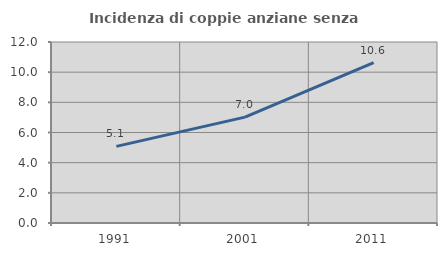
| Category | Incidenza di coppie anziane senza figli  |
|---|---|
| 1991.0 | 5.081 |
| 2001.0 | 7.018 |
| 2011.0 | 10.636 |